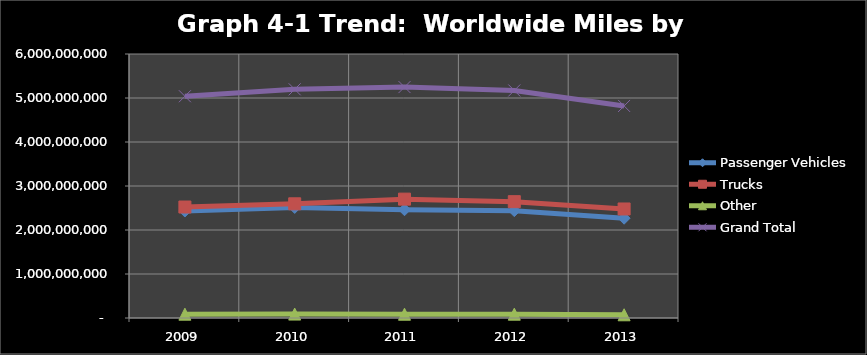
| Category | Passenger Vehicles | Trucks | Other | Grand Total |
|---|---|---|---|---|
| 2009.0 | 2431189755.9 | 2522155444 | 86743197 | 5040088397 |
| 2010.0 | 2512744272.4 | 2595359123.5 | 89258949.9 | 5197362345.9 |
| 2011.0 | 2460521232.4 | 2701454428.5 | 86279734 | 5248255395 |
| 2012.0 | 2440080774.4 | 2644066144.5 | 86709175 | 5170856094 |
| 2013.0 | 2268420061.6 | 2477963798.3 | 73145054 | 4819528914 |